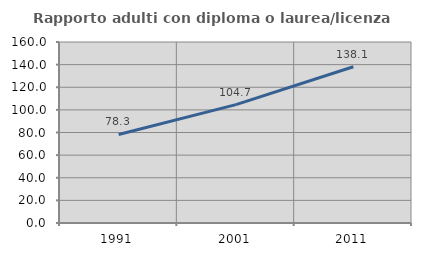
| Category | Rapporto adulti con diploma o laurea/licenza media  |
|---|---|
| 1991.0 | 78.299 |
| 2001.0 | 104.657 |
| 2011.0 | 138.147 |